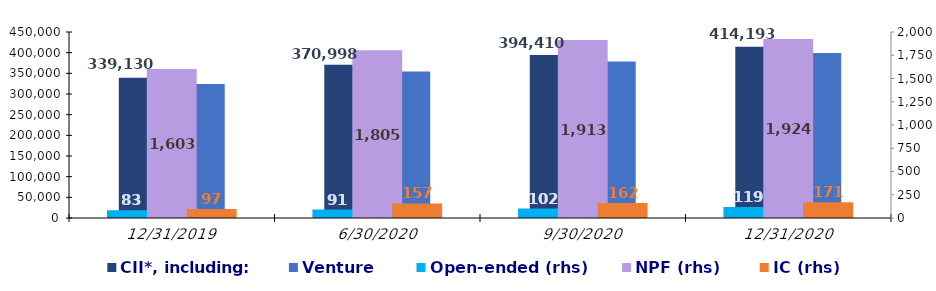
| Category | CII*, including: | Venture |
|---|---|---|
| 12/31/19 | 339129.8 | 324105 |
| 6/30/20 | 370998.12 | 354500.31 |
| 9/30/20 | 394410 | 378795.6 |
| 12/31/20 | 414192.85 | 399103.17 |